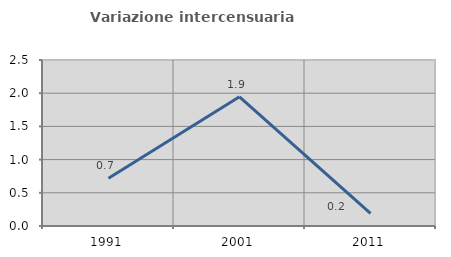
| Category | Variazione intercensuaria annua |
|---|---|
| 1991.0 | 0.72 |
| 2001.0 | 1.946 |
| 2011.0 | 0.191 |